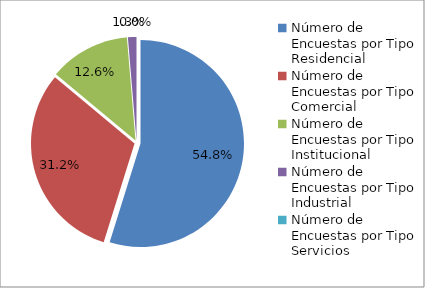
| Category | Series 0 |
|---|---|
| 0 | 165 |
| 1 | 94 |
| 2 | 38 |
| 3 | 4 |
| 4 | 0 |